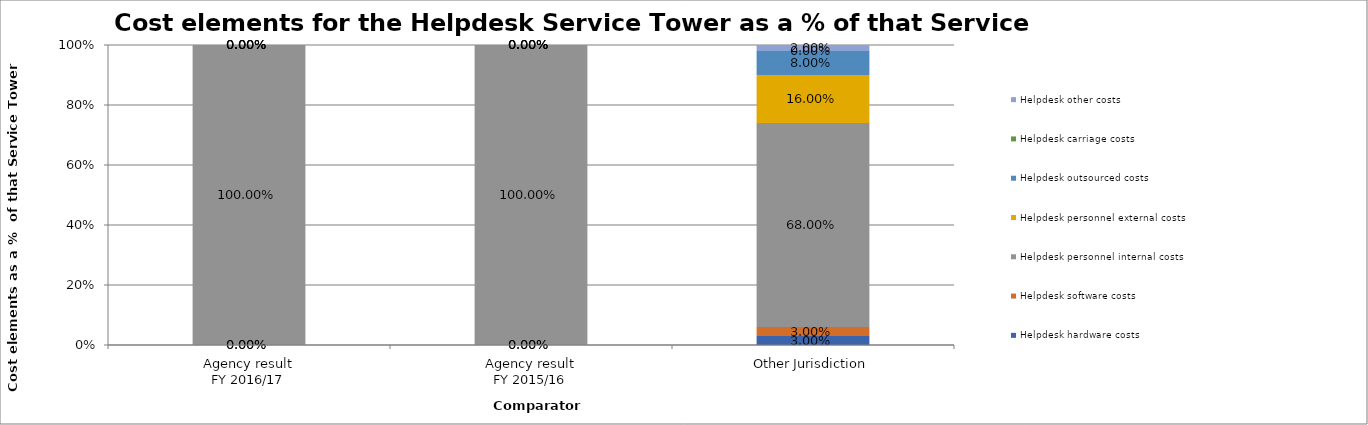
| Category | Helpdesk hardware costs | Helpdesk software costs | Helpdesk personnel internal costs | Helpdesk personnel external costs | Helpdesk outsourced costs | Helpdesk carriage costs | Helpdesk other costs |
|---|---|---|---|---|---|---|---|
| Agency result
FY 2016/17 | 0 | 0 | 1 | 0 | 0 | 0 | 0 |
| Agency result
FY 2015/16 | 0 | 0 | 1 | 0 | 0 | 0 | 0 |
| Other Jurisdiction | 0.03 | 0.03 | 0.68 | 0.16 | 0.08 | 0 | 0.02 |